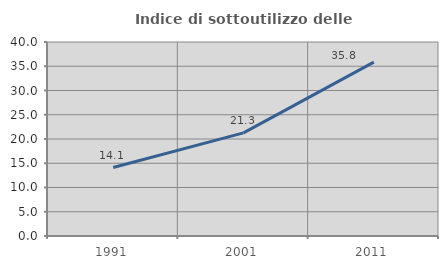
| Category | Indice di sottoutilizzo delle abitazioni  |
|---|---|
| 1991.0 | 14.122 |
| 2001.0 | 21.26 |
| 2011.0 | 35.842 |